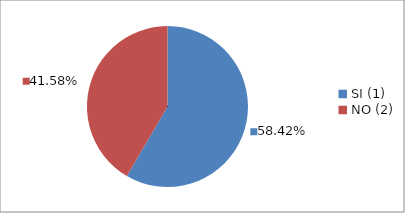
| Category | Series 0 |
|---|---|
| SI (1) | 0.584 |
| NO (2) | 0.416 |